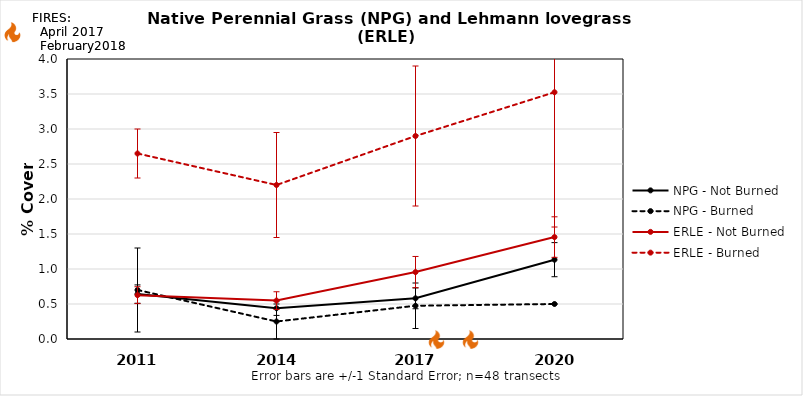
| Category | NPG - Not Burned | NPG - Burned | ERLE - Not Burned | ERLE - Burned |
|---|---|---|---|---|
| 2011.0 | 0.642 | 0.7 | 0.626 | 2.65 |
| 2014.0 | 0.439 | 0.25 | 0.549 | 2.2 |
| 2017.0 | 0.581 | 0.475 | 0.956 | 2.9 |
| 2020.0 | 1.133 | 0.5 | 1.456 | 3.525 |